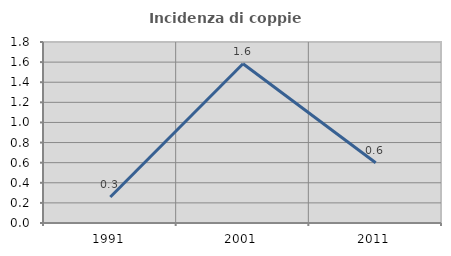
| Category | Incidenza di coppie miste |
|---|---|
| 1991.0 | 0.259 |
| 2001.0 | 1.583 |
| 2011.0 | 0.599 |